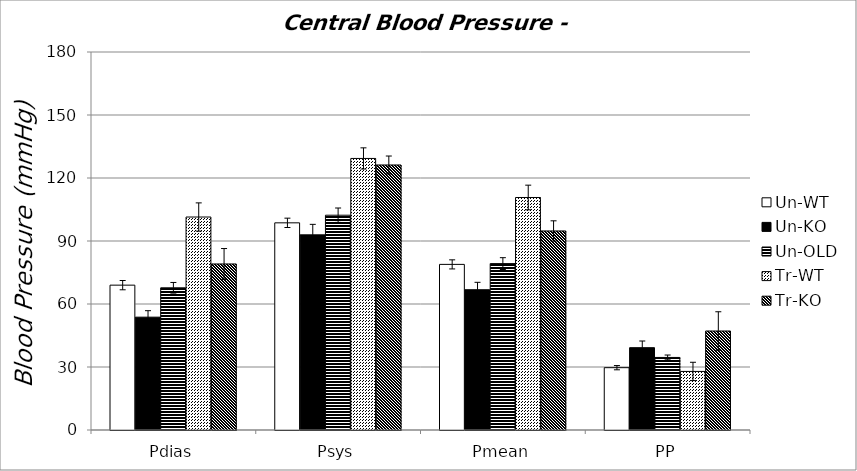
| Category | Un-WT | Un-KO | Un-OLD | Tr-WT | Tr-KO |
|---|---|---|---|---|---|
| Pdias | 68.974 | 53.728 | 67.728 | 101.42 | 79.066 |
| Psys | 98.65 | 92.927 | 102.279 | 129.31 | 126.201 |
| Pmean | 78.866 | 66.794 | 79.245 | 110.716 | 94.778 |
| PP | 29.676 | 39.199 | 34.551 | 27.89 | 47.136 |